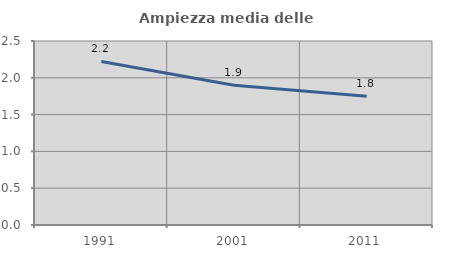
| Category | Ampiezza media delle famiglie |
|---|---|
| 1991.0 | 2.223 |
| 2001.0 | 1.9 |
| 2011.0 | 1.751 |